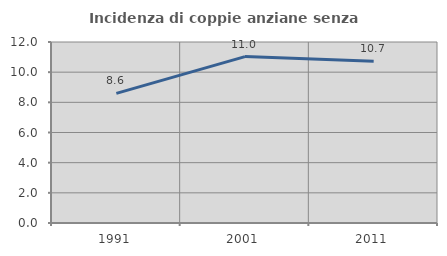
| Category | Incidenza di coppie anziane senza figli  |
|---|---|
| 1991.0 | 8.59 |
| 2001.0 | 11.032 |
| 2011.0 | 10.73 |